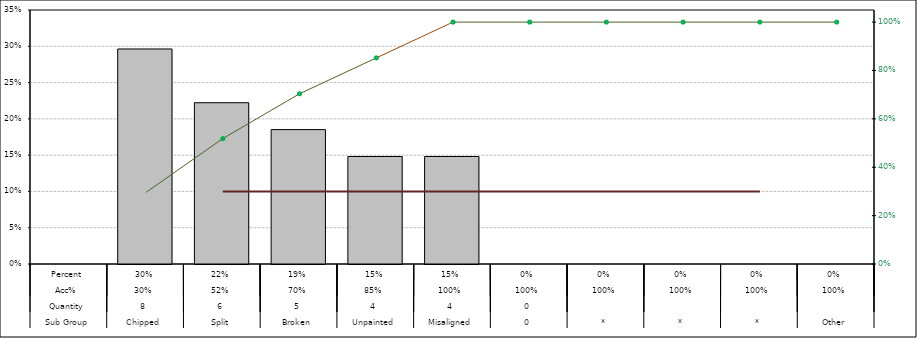
| Category | Pareto |
|---|---|
| 0 | 0 |
| 1 | 0.296 |
| 2 | 0.222 |
| 3 | 0.185 |
| 4 | 0.148 |
| 5 | 0.148 |
| 6 | 0 |
| 7 | 0 |
| 8 | 0 |
| 9 | 0 |
| 10 | 0 |